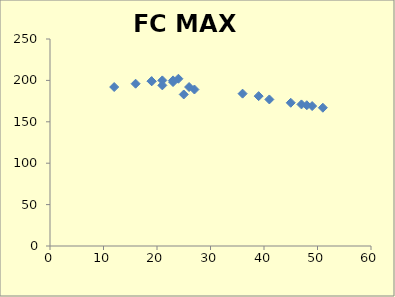
| Category | FC MAX    (y bpm) |
|---|---|
| 12.0 | 192 |
| 16.0 | 196 |
| 19.0 | 199 |
| 19.0 | 199 |
| 21.0 | 200 |
| 21.0 | 194 |
| 23.0 | 198 |
| 23.0 | 200 |
| 24.0 | 202 |
| 25.0 | 183 |
| 26.0 | 192 |
| 27.0 | 189 |
| 36.0 | 184 |
| 39.0 | 181 |
| 45.0 | 173 |
| 41.0 | 177 |
| 47.0 | 171 |
| 48.0 | 170 |
| 49.0 | 169 |
| 51.0 | 167 |